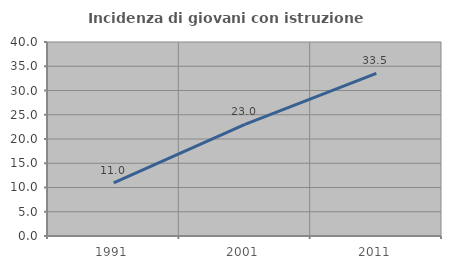
| Category | Incidenza di giovani con istruzione universitaria |
|---|---|
| 1991.0 | 10.954 |
| 2001.0 | 23.009 |
| 2011.0 | 33.52 |